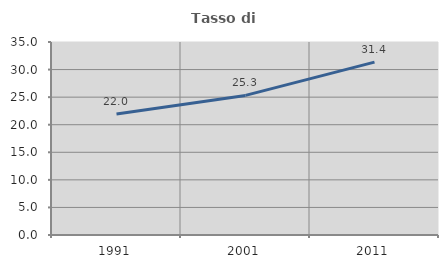
| Category | Tasso di occupazione   |
|---|---|
| 1991.0 | 21.952 |
| 2001.0 | 25.314 |
| 2011.0 | 31.351 |